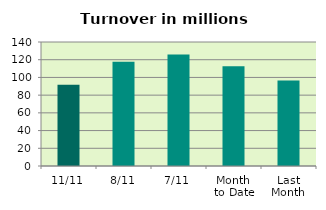
| Category | Series 0 |
|---|---|
| 11/11 | 91.828 |
| 8/11 | 117.791 |
| 7/11 | 125.881 |
| Month 
to Date | 112.754 |
| Last
Month | 96.433 |